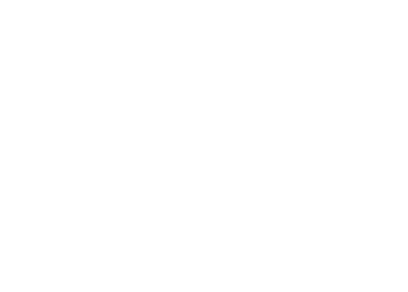
| Category | Total |
|---|---|
| A iniciar | 173 |
| Atrasado | 19 |
| Cancelado | 2 |
| Concluído | 10 |
| Em dia | 147 |
| Suspenso | 3 |
| - | 16 |
| (vazio) | 3 |